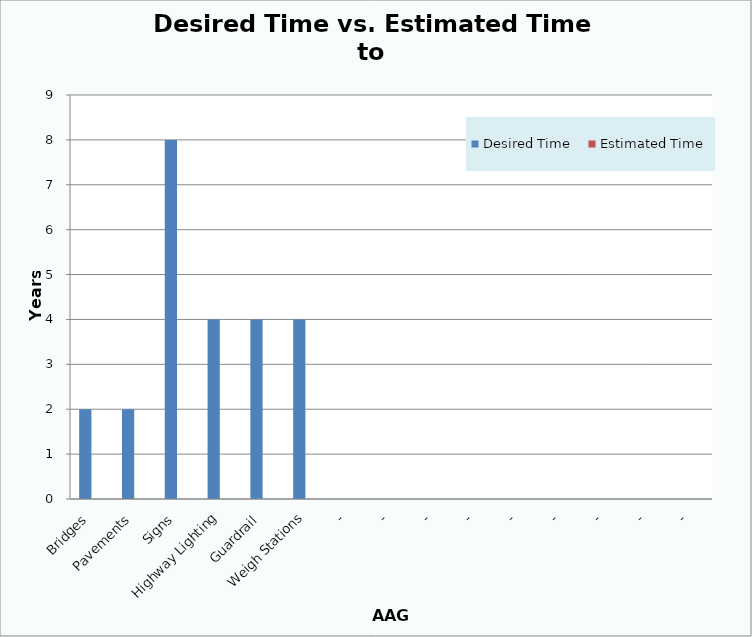
| Category | Desired Time  | Estimated Time |
|---|---|---|
| Bridges | 2 | 0 |
| Pavements | 2 | 0 |
| Signs | 8 | 0 |
| Highway Lighting | 4 | 0 |
| Guardrail | 4 | 0 |
| Weigh Stations | 4 | 0 |
| - | 0 | 0 |
| - | 0 | 0 |
| - | 0 | 0 |
| - | 0 | 0 |
| - | 0 | 0 |
| - | 0 | 0 |
| - | 0 | 0 |
| - | 0 | 0 |
| - | 0 | 0 |